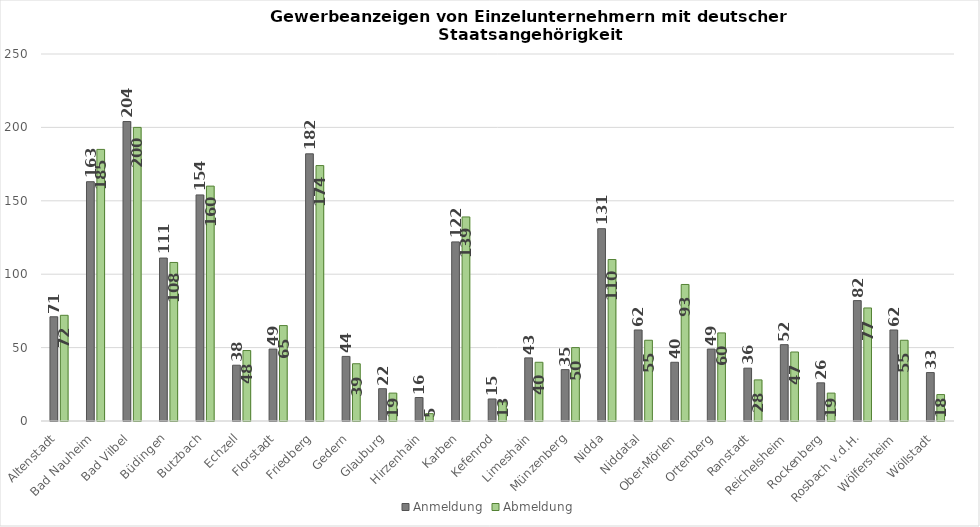
| Category | Anmeldung | Abmeldung |
|---|---|---|
| Altenstadt | 71 | 72 |
| Bad Nauheim | 163 | 185 |
| Bad Vilbel | 204 | 200 |
| Büdingen | 111 | 108 |
| Butzbach | 154 | 160 |
| Echzell | 38 | 48 |
| Florstadt | 49 | 65 |
| Friedberg | 182 | 174 |
| Gedern | 44 | 39 |
| Glauburg | 22 | 19 |
| Hirzenhain | 16 | 5 |
| Karben | 122 | 139 |
| Kefenrod | 15 | 13 |
| Limeshain | 43 | 40 |
| Münzenberg | 35 | 50 |
| Nidda | 131 | 110 |
| Niddatal | 62 | 55 |
| Ober-Mörlen | 40 | 93 |
| Ortenberg | 49 | 60 |
| Ranstadt | 36 | 28 |
| Reichelsheim | 52 | 47 |
| Rockenberg | 26 | 19 |
| Rosbach v.d.H. | 82 | 77 |
| Wölfersheim | 62 | 55 |
| Wöllstadt | 33 | 18 |